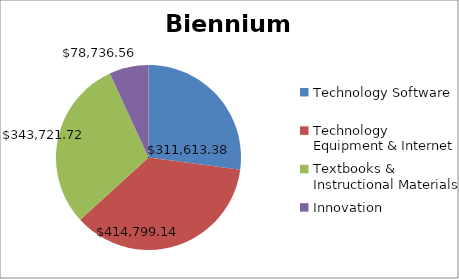
| Category | Biennium Amount |
|---|---|
| Technology Software | 311613.38 |
| Technology Equipment & Internet | 414799.14 |
| Textbooks & Instructional Materials | 343721.72 |
| Innovation | 78736.56 |